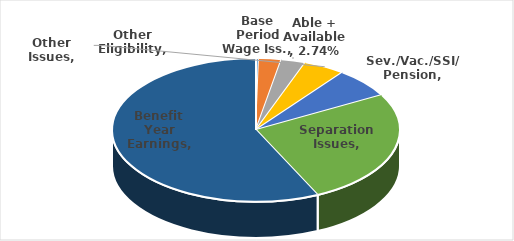
| Category | Series 0 |
|---|---|
| Base Period Wage Iss. | 0.003 |
| Other Eligibility | 0.025 |
| Able + Available | 0.027 |
| Other Issues | 0.047 |
| Sev./Vac./SSI/ Pension | 0.067 |
| Separation Issues | 0.26 |
| Benefit Year Earnings | 0.57 |